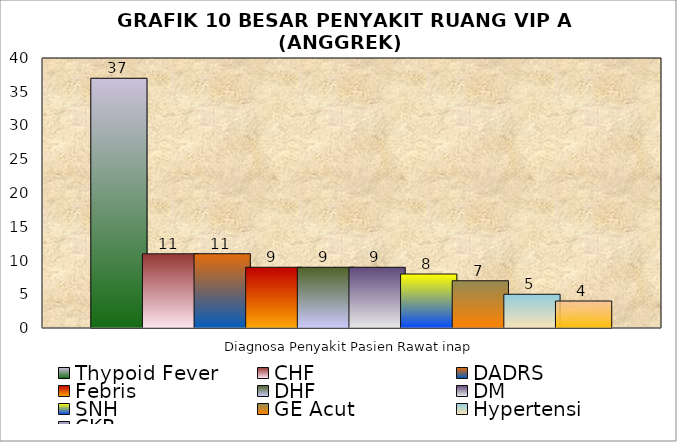
| Category | Thypoid Fever | CHF  | DADRS  | Febris | DHF | DM | SNH | GE Acut | Hypertensi  | CKR |
|---|---|---|---|---|---|---|---|---|---|---|
| 0 | 37 | 11 | 11 | 9 | 9 | 9 | 8 | 7 | 5 | 4 |